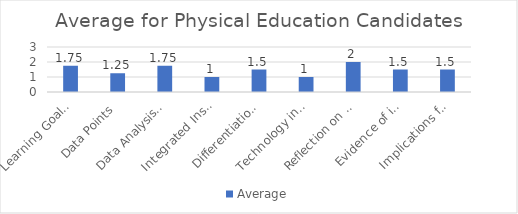
| Category | Average |
|---|---|
| Learning Goals Aligned with Pre-/Post-assessments ACEI 4.0 | 1.75 |
| Data Points | 1.25 |
| Data Analysis for Pedagogical Decisions ACEI 4.0 | 1.75 |
| Integrated Instruction ACEI 3.1 | 1 |
| Differentiation based on knowledge of individual learning ACEI 3.2 | 1.5 |
| Technology integration | 1 |
| Reflection on pedagogical decisions ACEI 1.0 | 2 |
| Evidence of impact on student learning ACEI 5.1 | 1.5 |
| Implications for teaching and professional development ACEI 5.1 | 1.5 |